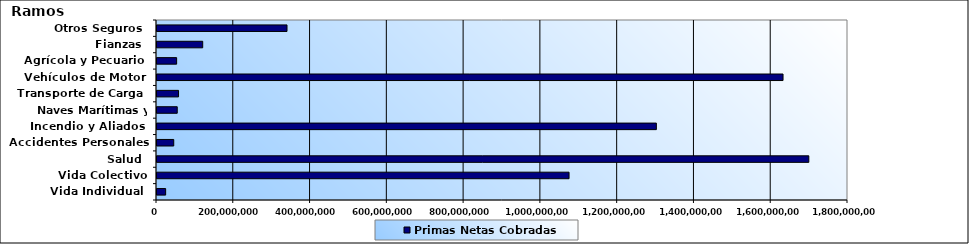
| Category | Primas Netas Cobradas |
|---|---|
| Vida Individual  | 22537593.89 |
| Vida Colectivo | 1073382421.13 |
| Salud  | 1697958034.14 |
| Accidentes Personales | 43615771.36 |
| Incendio y Aliados  | 1300820484.33 |
| Naves Marítimas y Aéreas  | 52713976.52 |
| Transporte de Carga  | 56119018.39 |
| Vehículos de Motor  | 1630794518.39 |
| Agrícola y Pecuario  | 51151066.21 |
| Fianzas  | 119053088.4 |
| Otros Seguros  | 338646033.64 |